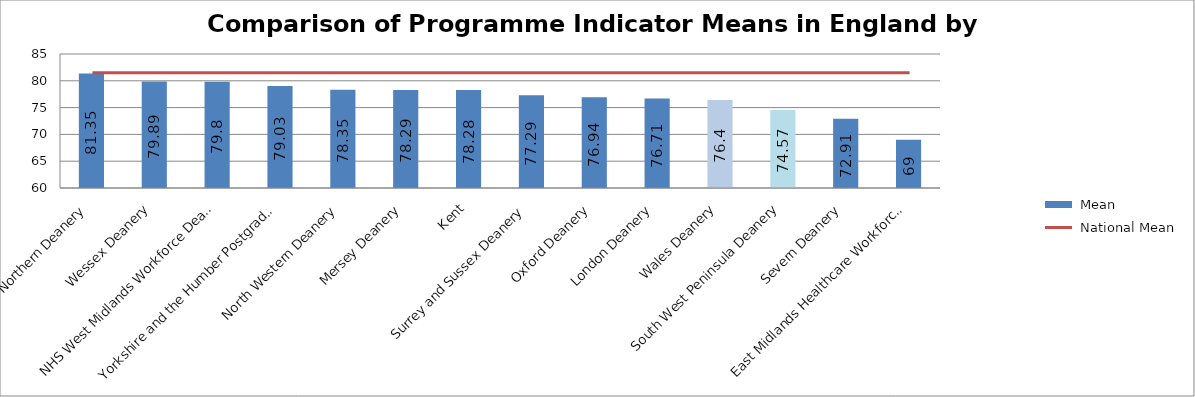
| Category |  Mean |
|---|---|
| Northern Deanery | 81.35 |
| Wessex Deanery | 79.89 |
| NHS West Midlands Workforce Deanery | 79.8 |
| Yorkshire and the Humber Postgraduate Deanery | 79.03 |
| North Western Deanery | 78.35 |
| Mersey Deanery | 78.29 |
| Kent, Surrey and Sussex Deanery | 78.28 |
| Oxford Deanery | 77.29 |
| London Deanery | 76.94 |
| Wales Deanery | 76.71 |
| South West Peninsula Deanery | 76.4 |
| Severn Deanery | 74.57 |
| East Midlands Healthcare Workforce Deanery | 72.91 |
| East of England Multi-Professional Deanery | 69 |